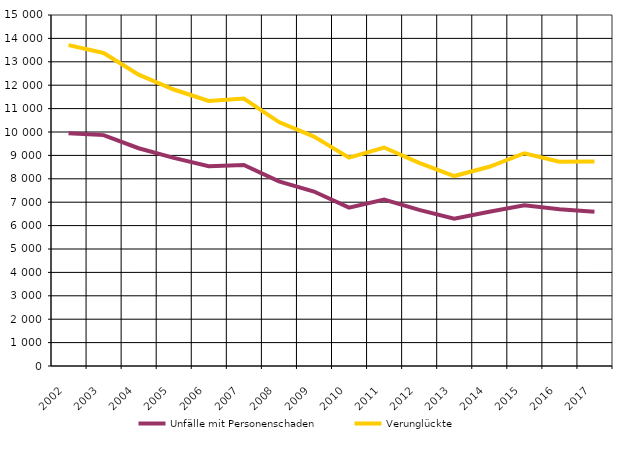
| Category |    Unfälle mit Personenschaden |    Verunglückte  |
|---|---|---|
| 2002.0 | 9949 | 13714 |
| 2003.0 | 9867 | 13379 |
| 2004.0 | 9306 | 12451 |
| 2005.0 | 8893 | 11816 |
| 2006.0 | 8539 | 11326 |
| 2007.0 | 8588 | 11427 |
| 2008.0 | 7893 | 10423 |
| 2009.0 | 7456 | 9805 |
| 2010.0 | 6769 | 8903 |
| 2011.0 | 7114 | 9336 |
| 2012.0 | 6674 | 8680 |
| 2013.0 | 6296 | 8118 |
| 2014.0 | 6591 | 8513 |
| 2015.0 | 6870 | 9092 |
| 2016.0 | 6700 | 8731 |
| 2017.0 | 6587 | 8743 |